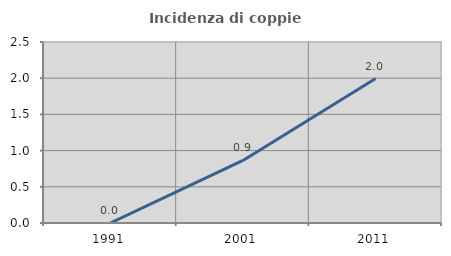
| Category | Incidenza di coppie miste |
|---|---|
| 1991.0 | 0 |
| 2001.0 | 0.865 |
| 2011.0 | 1.995 |